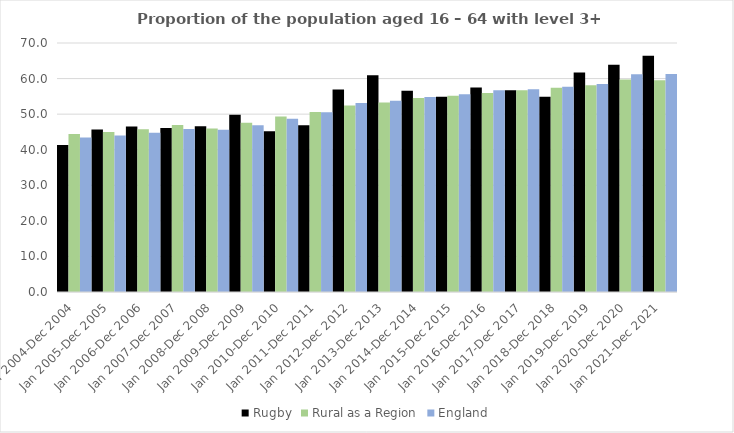
| Category | Rugby | Rural as a Region | England |
|---|---|---|---|
| Jan 2004-Dec 2004 | 41.3 | 44.405 | 43.4 |
| Jan 2005-Dec 2005 | 45.7 | 44.973 | 44 |
| Jan 2006-Dec 2006 | 46.5 | 45.774 | 44.8 |
| Jan 2007-Dec 2007 | 46.1 | 46.968 | 45.8 |
| Jan 2008-Dec 2008 | 46.6 | 45.964 | 45.6 |
| Jan 2009-Dec 2009 | 49.8 | 47.59 | 46.9 |
| Jan 2010-Dec 2010 | 45.2 | 49.362 | 48.7 |
| Jan 2011-Dec 2011 | 46.9 | 50.602 | 50.5 |
| Jan 2012-Dec 2012 | 56.9 | 52.439 | 53.1 |
| Jan 2013-Dec 2013 | 60.9 | 53.276 | 53.8 |
| Jan 2014-Dec 2014 | 56.6 | 54.57 | 54.8 |
| Jan 2015-Dec 2015 | 54.9 | 55.16 | 55.6 |
| Jan 2016-Dec 2016 | 57.5 | 55.941 | 56.7 |
| Jan 2017-Dec 2017 | 56.7 | 56.689 | 57 |
| Jan 2018-Dec 2018 | 54.9 | 57.389 | 57.7 |
| Jan 2019-Dec 2019 | 61.7 | 58.147 | 58.5 |
| Jan 2020-Dec 2020 | 63.9 | 59.771 | 61.2 |
| Jan 2021-Dec 2021 | 66.4 | 59.54 | 61.3 |